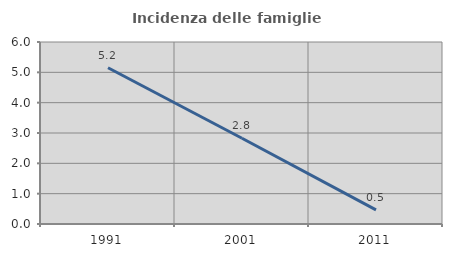
| Category | Incidenza delle famiglie numerose |
|---|---|
| 1991.0 | 5.151 |
| 2001.0 | 2.827 |
| 2011.0 | 0.465 |